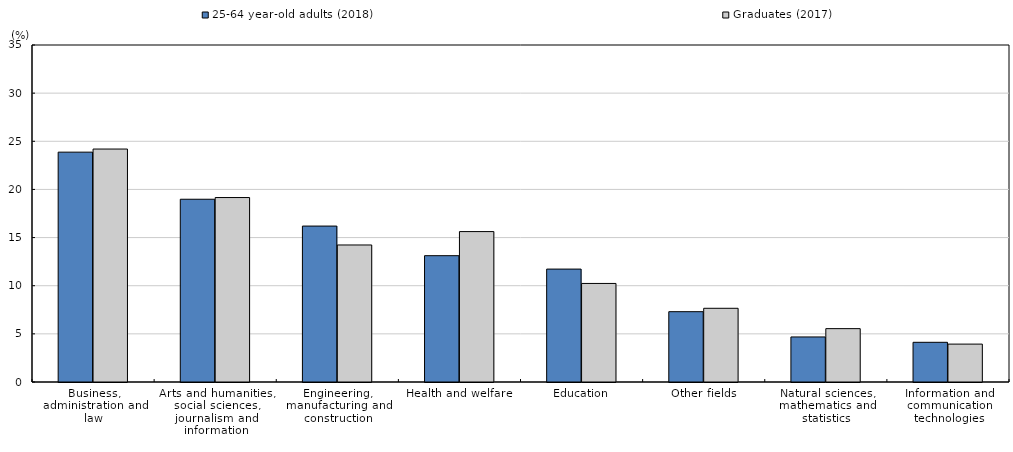
| Category | 25-64 year-old adults (2018) | Graduates (2017) |
|---|---|---|
| Business, administration and law | 23.871 | 24.195 |
| Arts and humanities, social sciences, journalism and information | 18.981 | 19.157 |
| Engineering, manufacturing and construction | 16.195 | 14.231 |
| Health and welfare | 13.119 | 15.621 |
| Education | 11.727 | 10.236 |
| Other fields | 7.303 | 7.655 |
| Natural sciences, mathematics and statistics | 4.68 | 5.542 |
| Information and communication technologies | 4.123 | 3.936 |